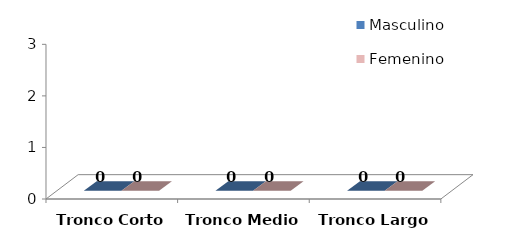
| Category | Masculino | Femenino |
|---|---|---|
| Tronco Corto | 0 | 0 |
| Tronco Medio | 0 | 0 |
| Tronco Largo | 0 | 0 |